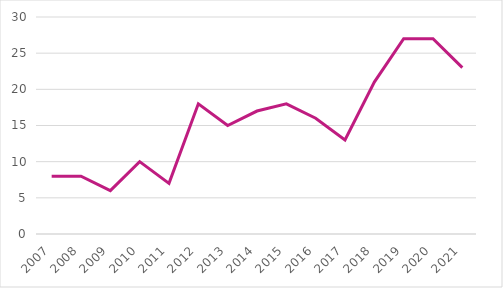
| Category | Spinouts fra universiteterne  |
|---|---|
| 2007.0 | 8 |
| 2008.0 | 8 |
| 2009.0 | 6 |
| 2010.0 | 10 |
| 2011.0 | 7 |
| 2012.0 | 18 |
| 2013.0 | 15 |
| 2014.0 | 17 |
| 2015.0 | 18 |
| 2016.0 | 16 |
| 2017.0 | 13 |
| 2018.0 | 21 |
| 2019.0 | 27 |
| 2020.0 | 27 |
| 2021.0 | 23 |